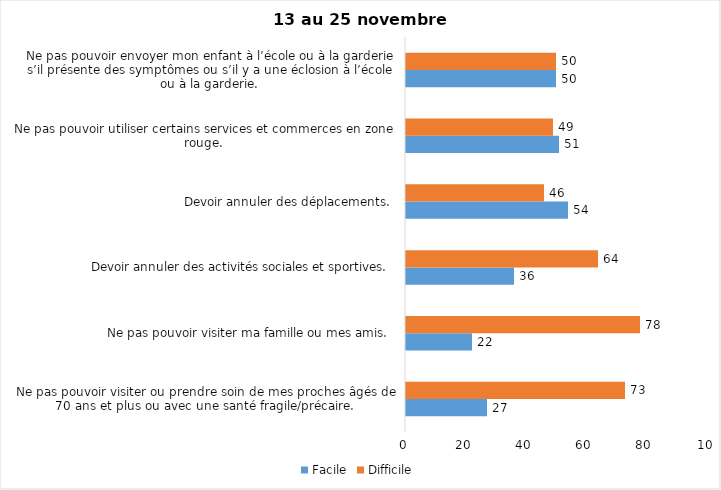
| Category | Facile | Difficile |
|---|---|---|
| Ne pas pouvoir visiter ou prendre soin de mes proches âgés de 70 ans et plus ou avec une santé fragile/précaire.  | 27 | 73 |
| Ne pas pouvoir visiter ma famille ou mes amis.  | 22 | 78 |
| Devoir annuler des activités sociales et sportives.  | 36 | 64 |
| Devoir annuler des déplacements.  | 54 | 46 |
| Ne pas pouvoir utiliser certains services et commerces en zone rouge.  | 51 | 49 |
| Ne pas pouvoir envoyer mon enfant à l’école ou à la garderie s’il présente des symptômes ou s’il y a une éclosion à l’école ou à la garderie.  | 50 | 50 |